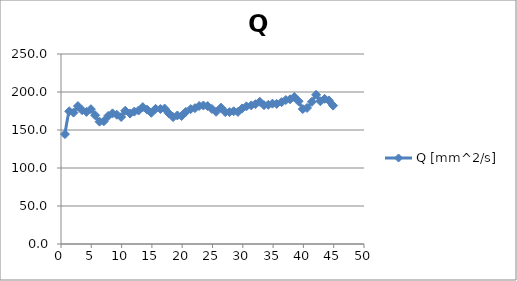
| Category | Q [mm^2/s] |
|---|---|
| 0.643 | 144.583 |
| 1.36 | 174.653 |
| 2.07 | 172.917 |
| 2.79 | 181.458 |
| 3.5 | 175.972 |
| 4.21 | 173.819 |
| 4.93 | 177.431 |
| 5.64 | 169.444 |
| 6.36 | 160.972 |
| 7.07 | 161.458 |
| 7.79 | 168.472 |
| 8.5 | 171.875 |
| 9.21 | 170.069 |
| 9.93 | 167.083 |
| 10.6 | 175.347 |
| 11.4 | 171.597 |
| 12.1 | 174.236 |
| 12.8 | 175.625 |
| 13.5 | 180.139 |
| 14.2 | 176.806 |
| 14.9 | 172.639 |
| 15.6 | 177.917 |
| 16.4 | 177.569 |
| 17.1 | 178.194 |
| 17.8 | 171.806 |
| 18.5 | 166.944 |
| 19.2 | 169.167 |
| 19.9 | 168.472 |
| 20.6 | 173.889 |
| 21.4 | 177.5 |
| 22.1 | 178.75 |
| 22.8 | 181.597 |
| 23.5 | 182.222 |
| 24.2 | 181.458 |
| 24.9 | 177.708 |
| 25.6 | 173.958 |
| 26.4 | 179.375 |
| 27.1 | 173.542 |
| 27.8 | 173.521 |
| 28.5 | 174.653 |
| 29.2 | 173.75 |
| 29.9 | 178.403 |
| 30.6 | 181.111 |
| 31.4 | 182.361 |
| 32.1 | 183.944 |
| 32.8 | 187.153 |
| 33.5 | 182.639 |
| 34.2 | 183.194 |
| 34.9 | 184.722 |
| 35.6 | 184.306 |
| 36.4 | 186.597 |
| 37.1 | 189.444 |
| 37.8 | 190.444 |
| 38.5 | 193.403 |
| 39.2 | 187.785 |
| 39.9 | 177.569 |
| 40.6 | 179.028 |
| 41.4 | 187.083 |
| 42.1 | 196.319 |
| 42.8 | 187.847 |
| 43.5 | 190.972 |
| 44.2 | 188.889 |
| 44.9 | 182.083 |